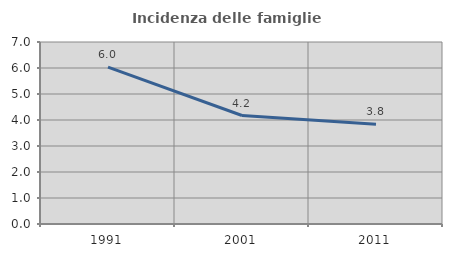
| Category | Incidenza delle famiglie numerose |
|---|---|
| 1991.0 | 6.034 |
| 2001.0 | 4.172 |
| 2011.0 | 3.832 |